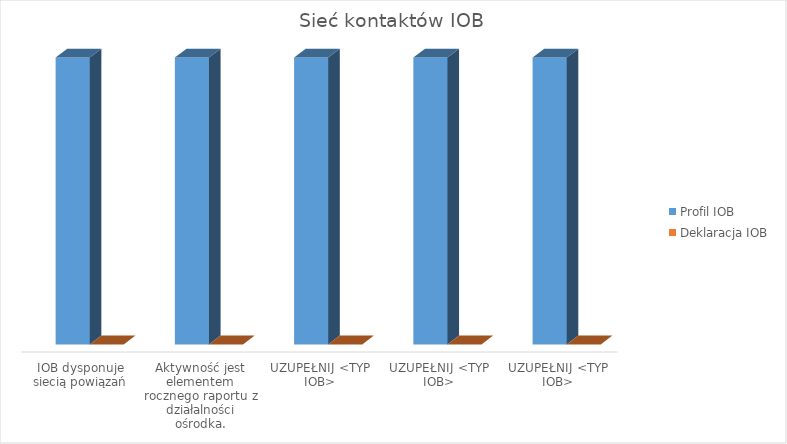
| Category | Profil IOB | Deklaracja IOB |
|---|---|---|
| IOB dysponuje siecią powiązań | 1 | 0 |
| Aktywność jest elementem rocznego raportu z działalności ośrodka. | 1 | 0 |
| UZUPEŁNIJ <TYP IOB> | 1 | 0 |
| UZUPEŁNIJ <TYP IOB> | 1 | 0 |
| UZUPEŁNIJ <TYP IOB> | 1 | 0 |